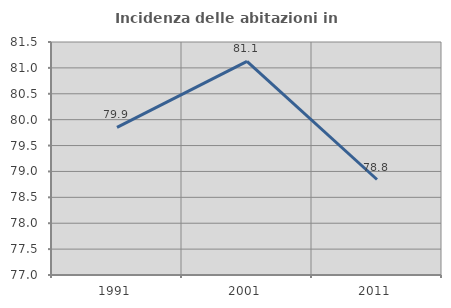
| Category | Incidenza delle abitazioni in proprietà  |
|---|---|
| 1991.0 | 79.85 |
| 2001.0 | 81.127 |
| 2011.0 | 78.844 |